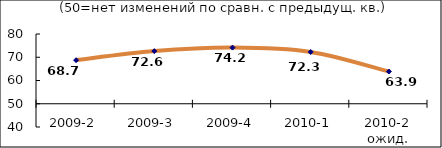
| Category | Диф.индекс ↓ |
|---|---|
| 2009-2 | 68.745 |
| 2009-3 | 72.645 |
| 2009-4 | 74.155 |
| 2010-1 | 72.27 |
| 2010-2 ожид. | 63.865 |